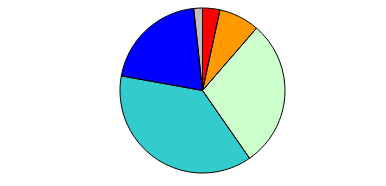
| Category | Series 0 |
|---|---|
| 0 | 6 |
| 1 | 14 |
| 2 | 51 |
| 3 | 66 |
| 4 | 36 |
| 5 | 3 |